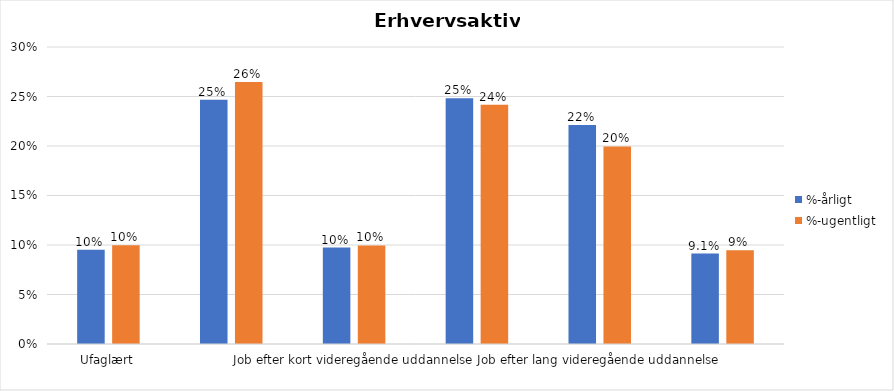
| Category | %-årligt | %-ugentligt |
|---|---|---|
| Ufaglært | 0.095 | 0.1 |
| Erhvervsfagligt job | 0.247 | 0.265 |
| Job efter kort videregående uddannelse | 0.097 | 0.1 |
| Job efter mellemlang videregående uddannelse | 0.248 | 0.242 |
| Job efter lang videregående uddannelse | 0.221 | 0.2 |
| Selvstændig | 0.091 | 0.095 |